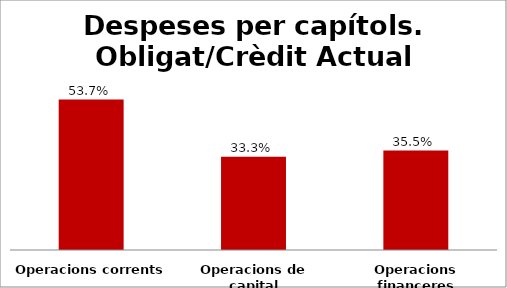
| Category | Series 0 |
|---|---|
| Operacions corrents | 0.537 |
| Operacions de capital | 0.333 |
| Operacions financeres | 0.355 |